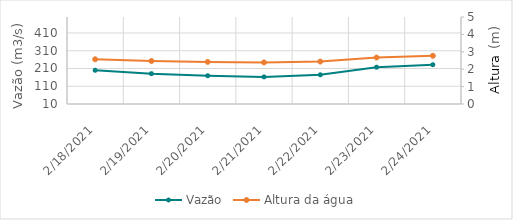
| Category | Vazão |
|---|---|
| 2/2/21 | 377.27 |
| 2/1/21 | 317.4 |
| 1/31/21 | 247.43 |
| 1/30/21 | 241.09 |
| 1/29/21 | 245.08 |
| 1/28/21 | 234.52 |
| 1/27/21 | 227.46 |